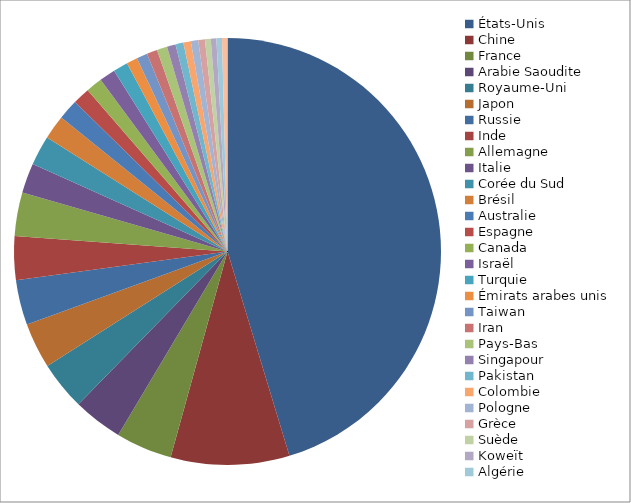
| Category | Series 0 |
|---|---|
| États-Unis | 2937119.1 |
| Chine | 581902.4 |
| France | 276306 |
| Arabie Saoudite | 242611.8 |
| Royaume-Uni | 239145.9 |
| Japon | 223866.9 |
| Russie | 221251.9 |
| Inde | 214327.5 |
| Allemagne | 213757.6 |
| Italie | 146460.5 |
| Corée du Sud | 145663.1 |
| Brésil | 118766.1 |
| Australie | 99484.4 |
| Espagne | 84448.7 |
| Canada | 80062.4 |
| Israël | 78589.2 |
| Turquie | 72253.9 |
| Émirats arabes unis | 53855.5 |
| Taiwan | 53050.9 |
| Iran | 51741.6 |
| Pays-Bas | 50515.7 |
| Singapour | 42613.2 |
| Pakistan | 38788 |
| Colombie | 36763 |
| Pologne | 36077.7 |
| Grèce | 32884.6 |
| Suède | 28007.4 |
| Koweït | 27395.8 |
| Algérie | 27278.7 |
| Norvège | 26666.2 |